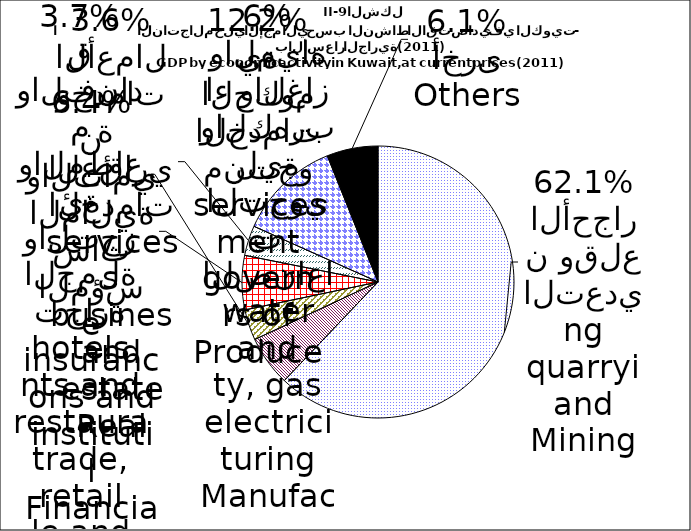
| Category | Series 0 |
|---|---|
| Mining and quarrying | 27575.4 |
| Manufacturing, electricity, gas and water | 2646 |
| Wholesale and retail trade, restaurants and hotels | 1623.1 |
| Financial institutions and insurance | 2859.4 |
| Real estate and business services | 1584.9 |
| Producers of government services | 5420.9 |
| Others | 2699.6 |